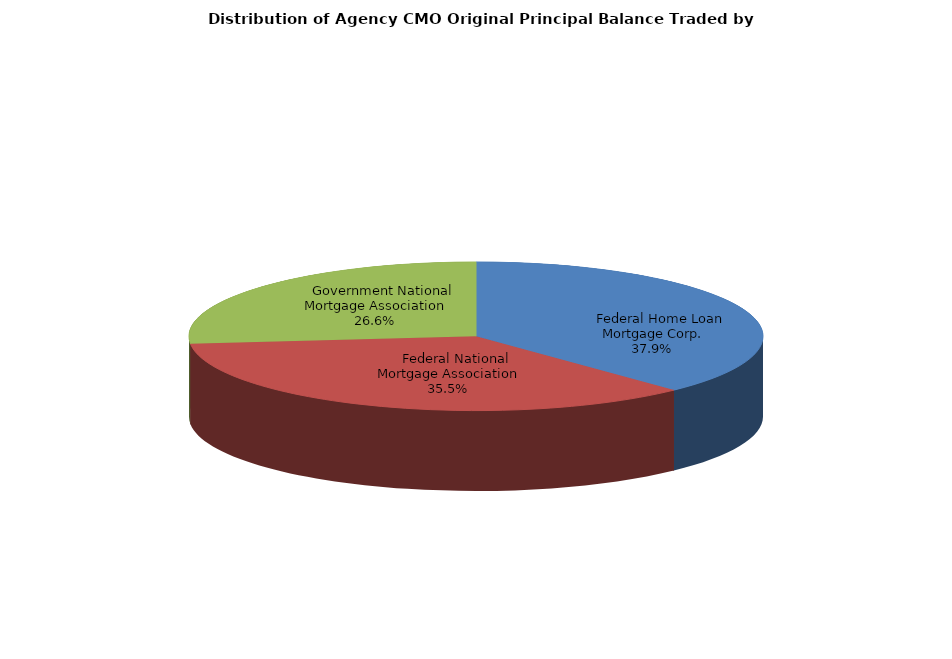
| Category | Series 0 |
|---|---|
|     Federal Home Loan Mortgage Corp. | 2344646772.538 |
|     Federal National Mortgage Association | 2196802889.046 |
|     Government National Mortgage Association | 1646469641.389 |